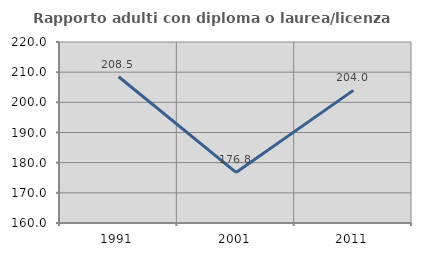
| Category | Rapporto adulti con diploma o laurea/licenza media  |
|---|---|
| 1991.0 | 208.475 |
| 2001.0 | 176.768 |
| 2011.0 | 203.96 |